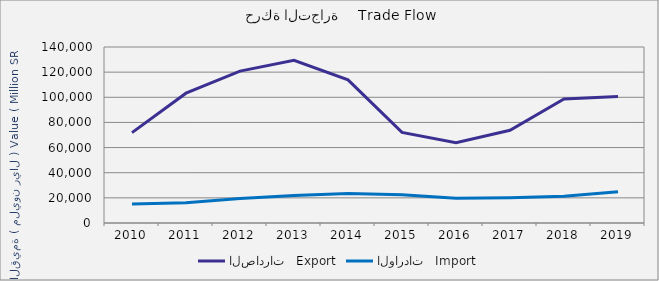
| Category | الصادرات   Export | الواردات   Import |
|---|---|---|
| 2010.0 | 71891265072 | 15116181988 |
| 2011.0 | 103271729813 | 16191118313 |
| 2012.0 | 120840682120 | 19580943752 |
| 2013.0 | 129444087040 | 21821667021 |
| 2014.0 | 113828373160 | 23508543092 |
| 2015.0 | 72052057139 | 22532077423 |
| 2016.0 | 63879803613 | 19662468637 |
| 2017.0 | 73801213531 | 20175674622 |
| 2018.0 | 98689367161 | 21322415535 |
| 2019.0 | 100703191449 | 24849637559 |